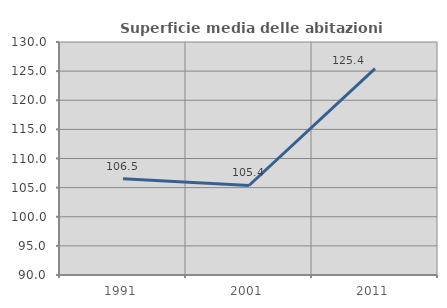
| Category | Superficie media delle abitazioni occupate |
|---|---|
| 1991.0 | 106.532 |
| 2001.0 | 105.365 |
| 2011.0 | 125.422 |